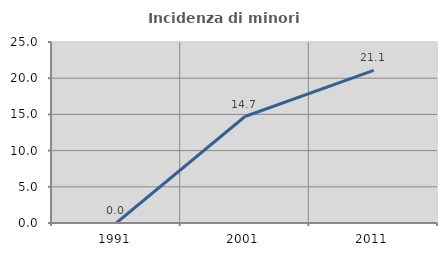
| Category | Incidenza di minori stranieri |
|---|---|
| 1991.0 | 0 |
| 2001.0 | 14.706 |
| 2011.0 | 21.084 |